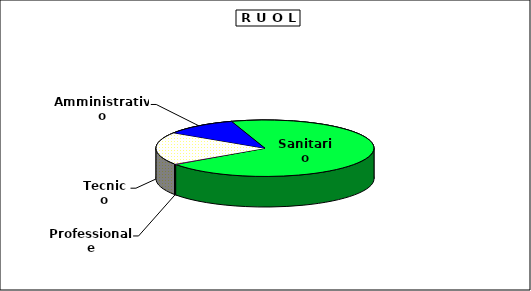
| Category | Personale |
|---|---|
| Professionale | 68 |
| Tecnico | 4197 |
| Amministrativo | 2446 |
| Sanitario | 15843 |